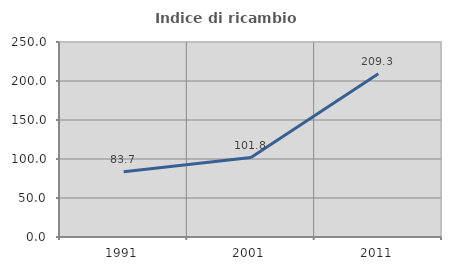
| Category | Indice di ricambio occupazionale  |
|---|---|
| 1991.0 | 83.694 |
| 2001.0 | 101.776 |
| 2011.0 | 209.295 |